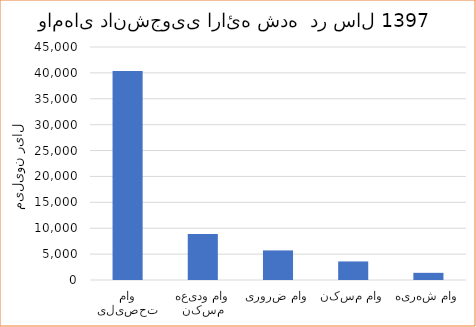
| Category | مبلغ (میلیون ریال) |
|---|---|
| وام تحصیلی | 40353 |
| وام ودیعه مسکن | 8872 |
| وام ضروری | 5714 |
| وام مسکن | 3584 |
| وام شهریه | 1385 |